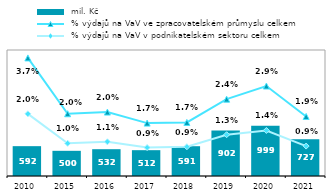
| Category |  mil. Kč |
|---|---|
| 2010.0 | 592.056 |
| 2015.0 | 499.552 |
| 2016.0 | 531.732 |
| 2017.0 | 512.334 |
| 2018.0 | 591.173 |
| 2019.0 | 901.621 |
| 2020.0 | 998.727 |
| 2021.0 | 727.253 |